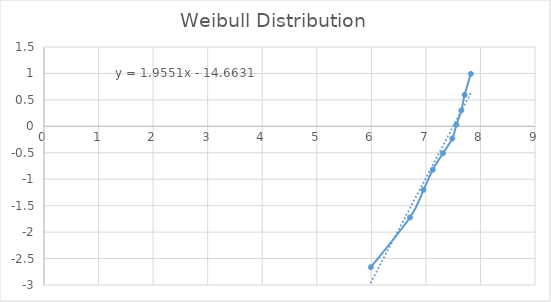
| Category | ln(ln(1/(1-F(t)))) |
|---|---|
| 5.991464547107982 | -2.664 |
| 6.709304340258298 | -1.723 |
| 6.956545443151569 | -1.202 |
| 7.126087273299125 | -0.822 |
| 7.313220387090301 | -0.509 |
| 7.484368643286131 | -0.23 |
| 7.560080465021827 | 0.033 |
| 7.649692623711514 | 0.299 |
| 7.709756864454165 | 0.594 |
| 7.824046010856292 | 0.993 |